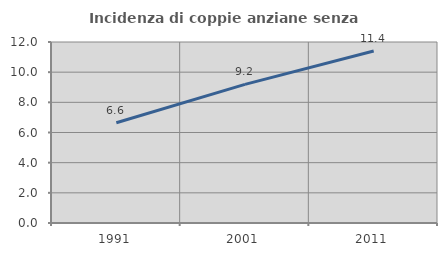
| Category | Incidenza di coppie anziane senza figli  |
|---|---|
| 1991.0 | 6.648 |
| 2001.0 | 9.194 |
| 2011.0 | 11.398 |